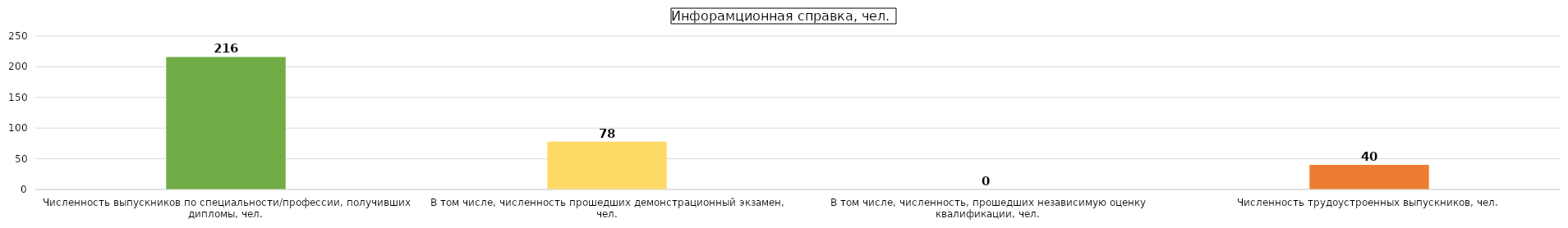
| Category | Series 0 |
|---|---|
| Численность выпускников по специальности/профессии, получивших дипломы, чел. | 216 |
| В том числе, численность прошедших демонстрационный экзамен, чел. | 78 |
| В том числе, численность, прошедших независимую оценку квалификации, чел. | 0 |
| Численность трудоустроенных выпускников, чел. | 40 |